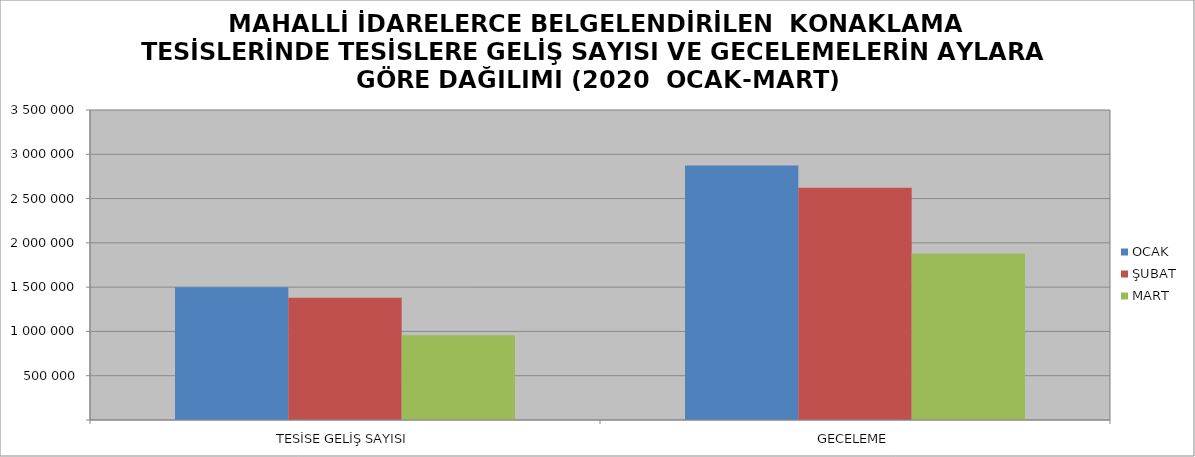
| Category | OCAK | ŞUBAT | MART |
|---|---|---|---|
| TESİSE GELİŞ SAYISI | 1497815 | 1380765 | 955554 |
| GECELEME | 2872303 | 2621819 | 1878971 |